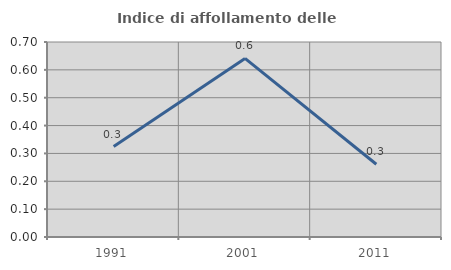
| Category | Indice di affollamento delle abitazioni  |
|---|---|
| 1991.0 | 0.325 |
| 2001.0 | 0.641 |
| 2011.0 | 0.261 |